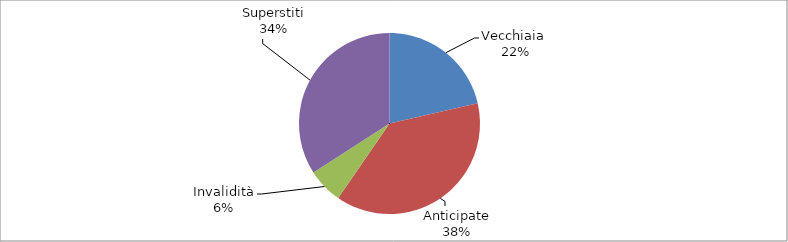
| Category | Series 0 |
|---|---|
| Vecchiaia  | 18058 |
| Anticipate | 32219 |
| Invalidità | 5320 |
| Superstiti | 28774 |